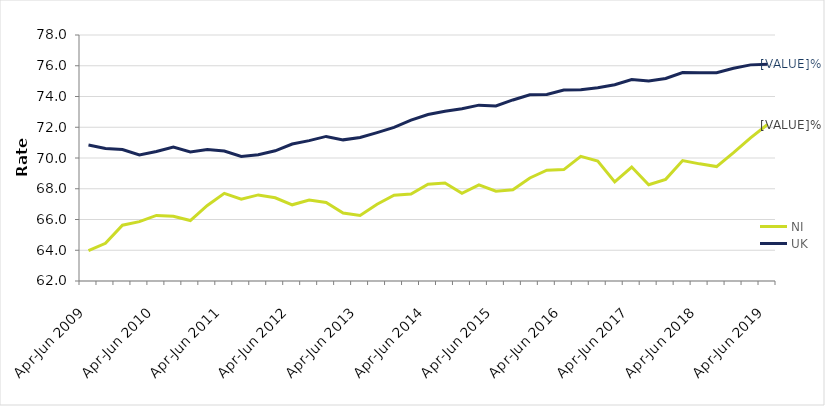
| Category | NI | UK |
|---|---|---|
| Apr-Jun 2009 | 63.973 | 70.84 |
| Jul-Sep 2009 | 64.453 | 70.617 |
| Oct-Dec 2009 | 65.629 | 70.552 |
| Jan-Mar 2010 | 65.858 | 70.195 |
| Apr-Jun 2010 | 66.264 | 70.423 |
| Jul-Sep 2010 | 66.205 | 70.705 |
| Oct-Dec 2010 | 65.931 | 70.39 |
| Jan-Mar 2011 | 66.913 | 70.546 |
| Apr-Jun 2011 | 67.699 | 70.45 |
| Jul-Sep 2011 | 67.317 | 70.105 |
| Oct-Dec 2011 | 67.599 | 70.218 |
| Jan-Mar 2012 | 67.412 | 70.467 |
| Apr-Jun 2012 | 66.955 | 70.908 |
| Jul-Sep 2012 | 67.271 | 71.131 |
| Oct-Dec 2012 | 67.111 | 71.404 |
| Jan-Mar 2013 | 66.421 | 71.18 |
| Apr-Jun 2013 | 66.259 | 71.332 |
| Jul-Sep 2013 | 66.99 | 71.654 |
| Oct-Dec 2013 | 67.584 | 71.994 |
| Jan-Mar 2014 | 67.657 | 72.46 |
| Apr-Jun 2014 | 68.296 | 72.83 |
| Jul-Sep 2014 | 68.375 | 73.043 |
| Oct-Dec 2014 | 67.708 | 73.203 |
| Jan-Mar 2015 | 68.249 | 73.437 |
| Apr-Jun 2015 | 67.839 | 73.383 |
| Jul-Sep 2015 | 67.93 | 73.776 |
| Oct-Dec 2015 | 68.699 | 74.112 |
| Jan-Mar 2016 | 69.205 | 74.135 |
| Apr-Jun 2016 | 69.246 | 74.417 |
| Jul-Sep 2016 | 70.107 | 74.447 |
| Oct-Dec 2016 | 69.8 | 74.566 |
| Jan-Mar 2017 | 68.449 | 74.769 |
| Apr-Jun 2017 | 69.411 | 75.104 |
| Jul-Sep 2017 | 68.262 | 75.007 |
| Oct-Dec 2017 | 68.61 | 75.175 |
| Jan-Mar 2018 | 69.833 | 75.561 |
| Apr-Jun 2018 | 69.62 | 75.549 |
| Jul-Sep 2018 | 69.441 | 75.553 |
| Oct-Dec 2018 | 70.349 | 75.833 |
| Jan-Mar 2019 | 71.307 | 76.057 |
| Apr-Jun 2019 | 72.176 | 76.102 |